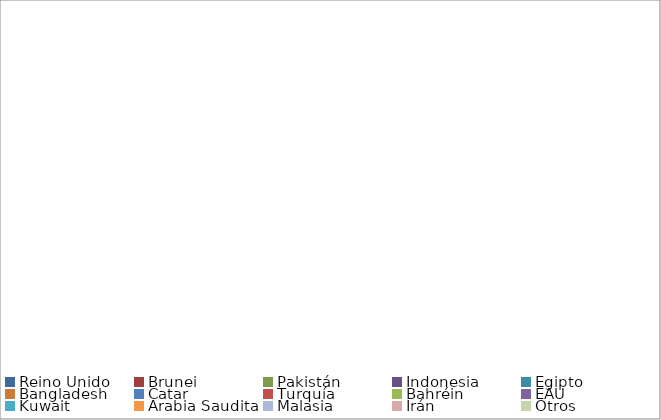
| Category | Series 0 |
|---|---|
| Reino Unido | 3131.629 |
| Brunei | 4425.6 |
| Pakistán | 5229.9 |
| Indonesia | 13080.6 |
| Egipto | 15531.2 |
| Bangladesh | 19508.7 |
| Catar | 32581 |
| Turquía | 39104.214 |
| Bahréin | 49979 |
| EAU | 64418.525 |
| Kuwait | 73222.6 |
| Arabia Saudita | 93385.4 |
| Malasia | 234080.2 |
| Irán | 335859.8 |
| Otros | 9234.212 |